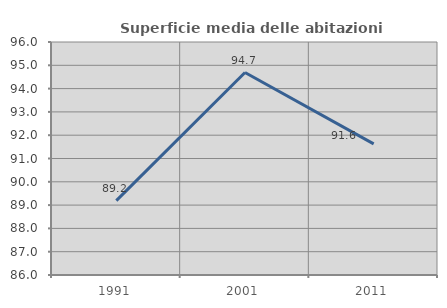
| Category | Superficie media delle abitazioni occupate |
|---|---|
| 1991.0 | 89.194 |
| 2001.0 | 94.689 |
| 2011.0 | 91.627 |